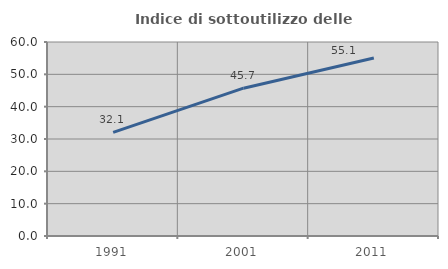
| Category | Indice di sottoutilizzo delle abitazioni  |
|---|---|
| 1991.0 | 32.061 |
| 2001.0 | 45.714 |
| 2011.0 | 55.072 |